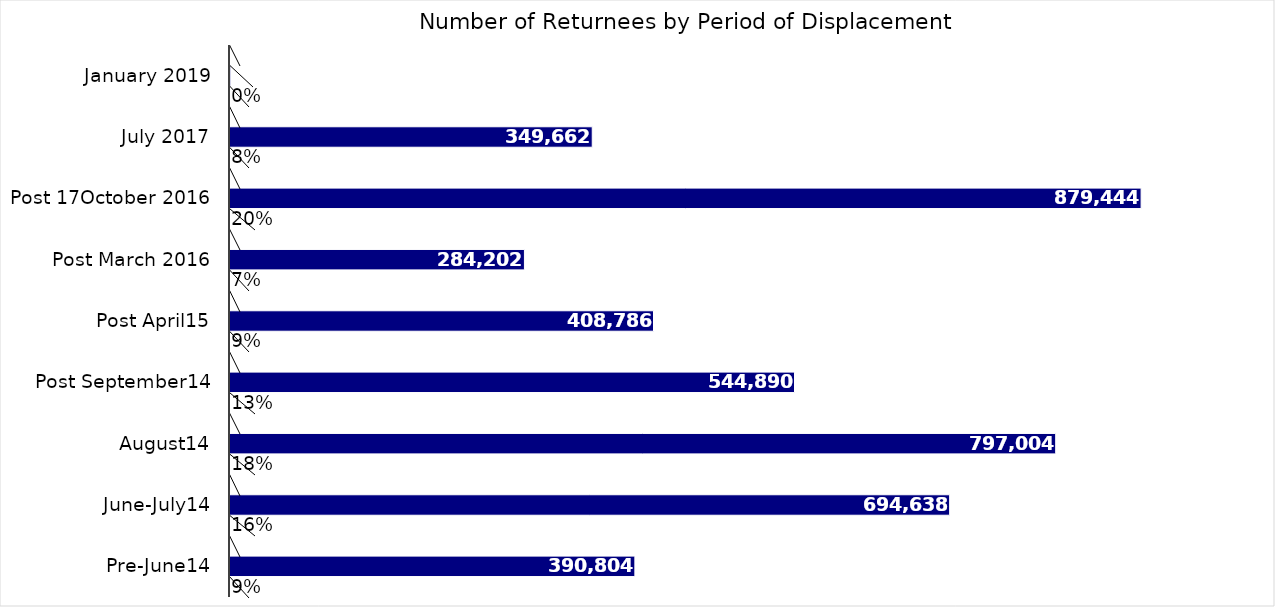
| Category | Sum of % | Sum of Returnees Individuals  | Sum of rank |
|---|---|---|---|
| Pre-June14 | 0.09 | 390804 | 9 |
| June-July14 | 0.16 | 694638 | 8 |
| August14 | 0.183 | 797004 | 7 |
| Post September14 | 0.125 | 544890 | 6 |
| Post April15 | 0.094 | 408786 | 5 |
| Post March 2016 | 0.065 | 284202 | 4 |
| Post 17October 2016 | 0.202 | 879444 | 3 |
| July 2017 | 0.08 | 349662 | 2 |
| January 2019 | 0 | 720 | 1 |